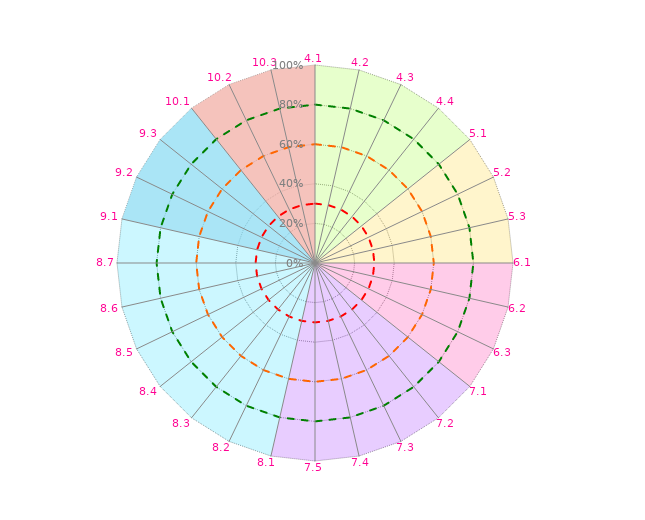
| Category | Coloriage Art 4 | Coloriage Art 5 | Coloriage Art  6 | Coloriage Art 7 | Coloriage Art 8 | Coloriage Art9 | Coloriage Art10 | Conforme | Convaincant | Informel | Estimation ISO 9001 |
|---|---|---|---|---|---|---|---|---|---|---|---|
| 4.1 | 1 | 0 | 0 | 0 | 0 | 0 | 1 | 0.8 | 0.6 | 0.3 | 0 |
| 4.2 | 1 | 0 | 0 | 0 | 0 | 0 | 0 | 0.8 | 0.6 | 0.3 | 0 |
| 4.3 | 1 | 0 | 0 | 0 | 0 | 0 | 0 | 0.8 | 0.6 | 0.3 | 0 |
| 4.4 | 1 | 0 | 0 | 0 | 0 | 0 | 0 | 0.8 | 0.6 | 0.3 | 0 |
| 5.1 | 1 | 1 | 0 | 0 | 0 | 0 | 0 | 0.8 | 0.6 | 0.3 | 0 |
| 5.2 | 0 | 1 | 0 | 0 | 0 | 0 | 0 | 0.8 | 0.6 | 0.3 | 0 |
| 5.3 | 0 | 1 | 0 | 0 | 0 | 0 | 0 | 0.8 | 0.6 | 0.3 | 0 |
| 6.1 | 0 | 1 | 1 | 0 | 0 | 0 | 0 | 0.8 | 0.6 | 0.3 | 0 |
| 6.2 | 0 | 0 | 1 | 0 | 0 | 0 | 0 | 0.8 | 0.6 | 0.3 | 0 |
| 6.3 | 0 | 0 | 1 | 0 | 0 | 0 | 0 | 0.8 | 0.6 | 0.3 | 0 |
| 7.1 | 0 | 0 | 1 | 1 | 0 | 0 | 0 | 0.8 | 0.6 | 0.3 | 0 |
| 7.2 | 0 | 0 | 0 | 1 | 0 | 0 | 0 | 0.8 | 0.6 | 0.3 | 0 |
| 7.3 | 0 | 0 | 0 | 1 | 0 | 0 | 0 | 0.8 | 0.6 | 0.3 | 0 |
| 7.4 | 0 | 0 | 0 | 1 | 0 | 0 | 0 | 0.8 | 0.6 | 0.3 | 0 |
| 7.5 | 0 | 0 | 0 | 1 | 0 | 0 | 0 | 0.8 | 0.6 | 0.3 | 0 |
| 8.1 | 0 | 0 | 0 | 1 | 1 | 0 | 0 | 0.8 | 0.6 | 0.3 | 0 |
| 8.2 | 0 | 0 | 0 | 0 | 1 | 0 | 0 | 0.8 | 0.6 | 0.3 | 0 |
| 8.3 | 0 | 0 | 0 | 0 | 1 | 0 | 0 | 0.8 | 0.6 | 0.3 | 0 |
| 8.4 | 0 | 0 | 0 | 0 | 1 | 0 | 0 | 0.8 | 0.6 | 0.3 | 0 |
| 8.5 | 0 | 0 | 0 | 0 | 1 | 0 | 0 | 0.8 | 0.6 | 0.3 | 0 |
| 8.6 | 0 | 0 | 0 | 0 | 1 | 0 | 0 | 0.8 | 0.6 | 0.3 | 0 |
| 8.7 | 0 | 0 | 0 | 0 | 1 | 0 | 0 | 0.8 | 0.6 | 0.3 | 0 |
| 9.1 | 0 | 0 | 0 | 0 | 1 | 1 | 0 | 0.8 | 0.6 | 0.3 | 0 |
| 9.2 | 0 | 0 | 0 | 0 | 0 | 1 | 0 | 0.8 | 0.6 | 0.3 | 0 |
| 9.3 | 0 | 0 | 0 | 0 | 0 | 1 | 0 | 0.8 | 0.6 | 0.3 | 0 |
| 10.1 | 0 | 0 | 0 | 0 | 0 | 1 | 1 | 0.8 | 0.6 | 0.3 | 0 |
| 10.2 | 0 | 0 | 0 | 0 | 0 | 0 | 1 | 0.8 | 0.6 | 0.3 | 0 |
| 10.3 | 0 | 0 | 0 | 0 | 0 | 0 | 1 | 0.8 | 0.6 | 0.3 | 0 |